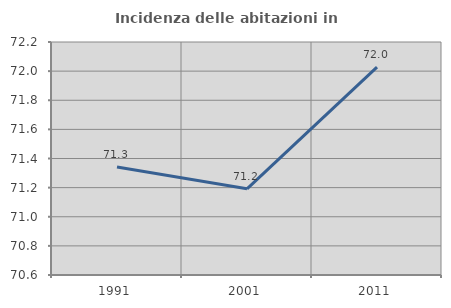
| Category | Incidenza delle abitazioni in proprietà  |
|---|---|
| 1991.0 | 71.341 |
| 2001.0 | 71.192 |
| 2011.0 | 72.028 |